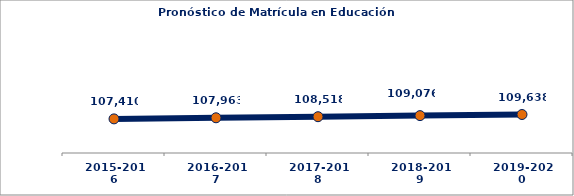
| Category | Series 1 |
|---|---|
| 2015-2016 | 107410.46 |
| 2016-2017 | 107962.522 |
| 2017-2018 | 108517.742 |
| 2018-2019 | 109076.143 |
| 2019-2020 | 109637.748 |